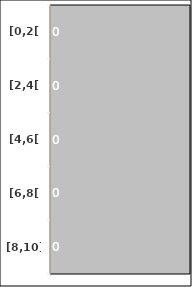
| Category | Series 0 |
|---|---|
| [0,2[ | 0 |
| [2,4[ | 0 |
| [4,6[ | 0 |
| [6,8[ | 0 |
| [8,10] | 0 |